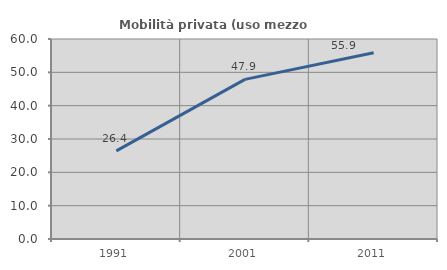
| Category | Mobilità privata (uso mezzo privato) |
|---|---|
| 1991.0 | 26.44 |
| 2001.0 | 47.89 |
| 2011.0 | 55.894 |